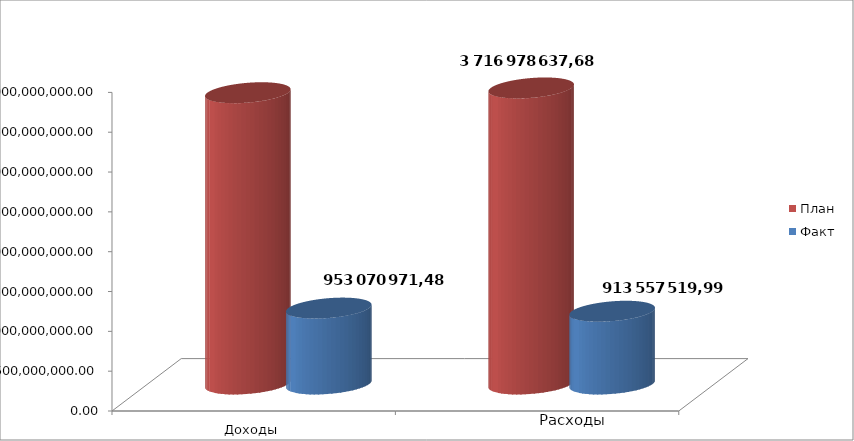
| Category | План | Факт |
|---|---|---|
| 0 | 3657071727.18 | 953070971.48 |
| 1 | 3716978637.68 | 913557519.99 |